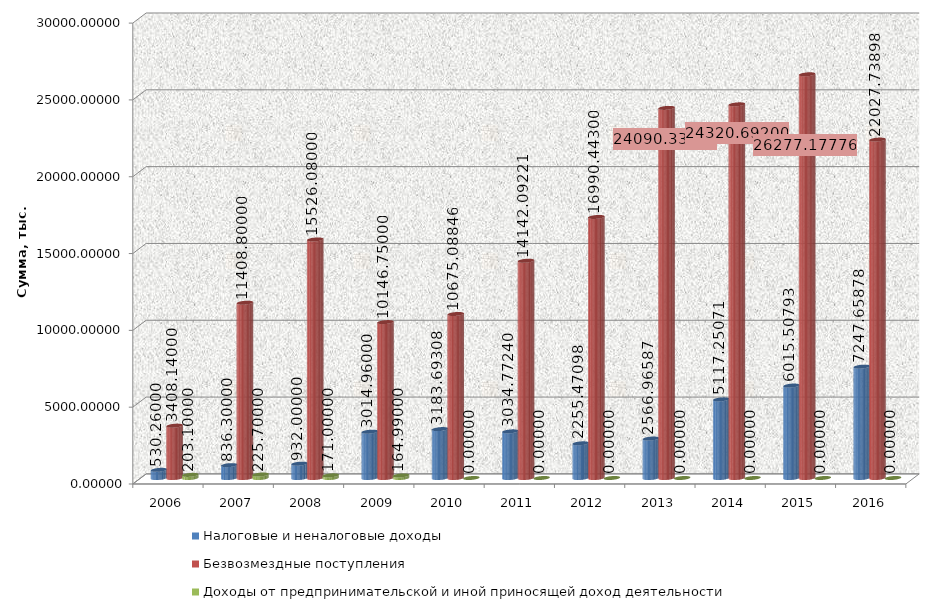
| Category | Налоговые и неналоговые доходы | Безвозмездные поступления | Доходы от предпринимательской и иной приносящей доход деятельности |
|---|---|---|---|
| 2006.0 | 530.26 | 3408.14 | 203.1 |
| 2007.0 | 836.3 | 11408.8 | 225.7 |
| 2008.0 | 932 | 15526.08 | 171 |
| 2009.0 | 3014.96 | 10146.75 | 164.99 |
| 2010.0 | 3183.693 | 10675.088 | 0 |
| 2011.0 | 3034.772 | 14142.092 | 0 |
| 2012.0 | 2255.471 | 16990.443 | 0 |
| 2013.0 | 2566.966 | 24090.331 | 0 |
| 2014.0 | 5117.251 | 24320.692 | 0 |
| 2015.0 | 6015.508 | 26277.178 | 0 |
| 2016.0 | 7247.659 | 22027.739 | 0 |